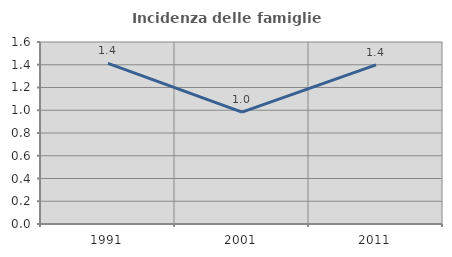
| Category | Incidenza delle famiglie numerose |
|---|---|
| 1991.0 | 1.412 |
| 2001.0 | 0.984 |
| 2011.0 | 1.398 |